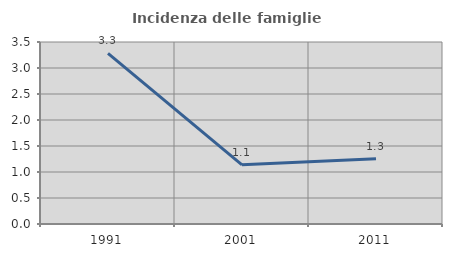
| Category | Incidenza delle famiglie numerose |
|---|---|
| 1991.0 | 3.282 |
| 2001.0 | 1.137 |
| 2011.0 | 1.254 |